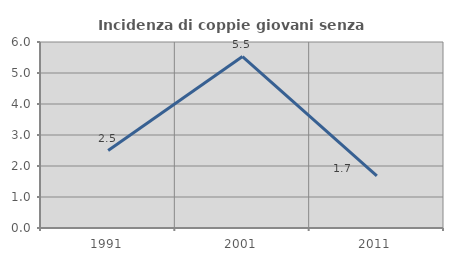
| Category | Incidenza di coppie giovani senza figli |
|---|---|
| 1991.0 | 2.5 |
| 2001.0 | 5.532 |
| 2011.0 | 1.681 |